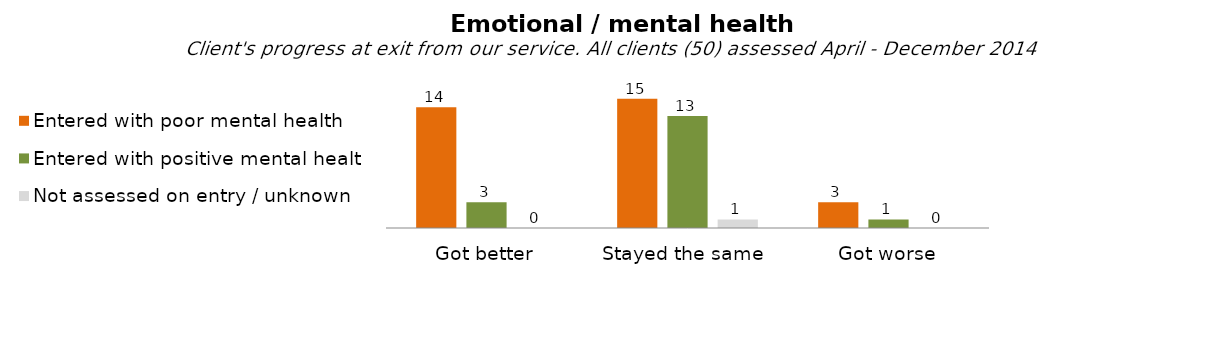
| Category | Entered with poor mental health | Entered with positive mental health | Not assessed on entry / unknown |
|---|---|---|---|
| Got better | 14 | 3 | 0 |
| Stayed the same  | 15 | 13 | 1 |
| Got worse | 3 | 1 | 0 |